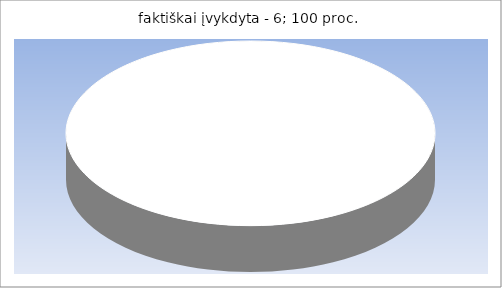
| Category | faktiškai įvykdyta – |
|---|---|
| 0 | 6 |